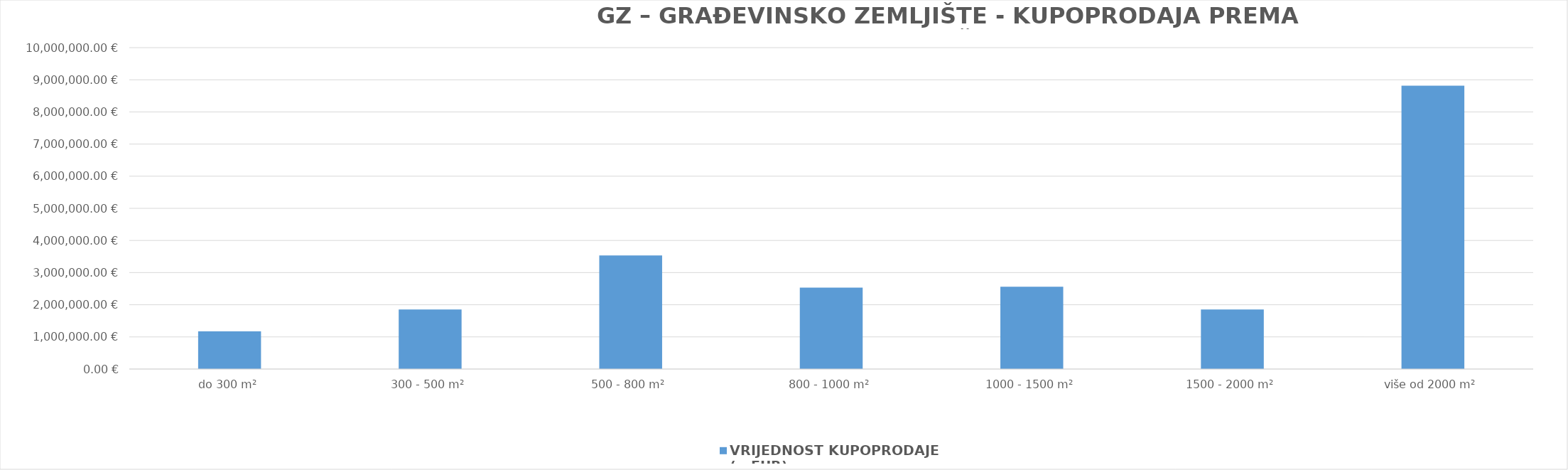
| Category | VRIJEDNOST KUPOPRODAJE (u EUR) |
|---|---|
| do 300 m² | 1172958.244 |
| 300 - 500 m² | 1852052.93 |
| 500 - 800 m² | 3536730.378 |
| 800 - 1000 m² | 2533007.484 |
| 1000 - 1500 m² | 2563398.561 |
| 1500 - 2000 m² | 1850760 |
| više od 2000 m² | 8817026.437 |